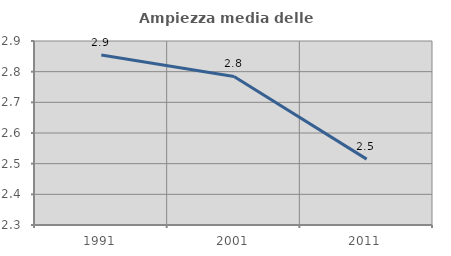
| Category | Ampiezza media delle famiglie |
|---|---|
| 1991.0 | 2.855 |
| 2001.0 | 2.784 |
| 2011.0 | 2.515 |